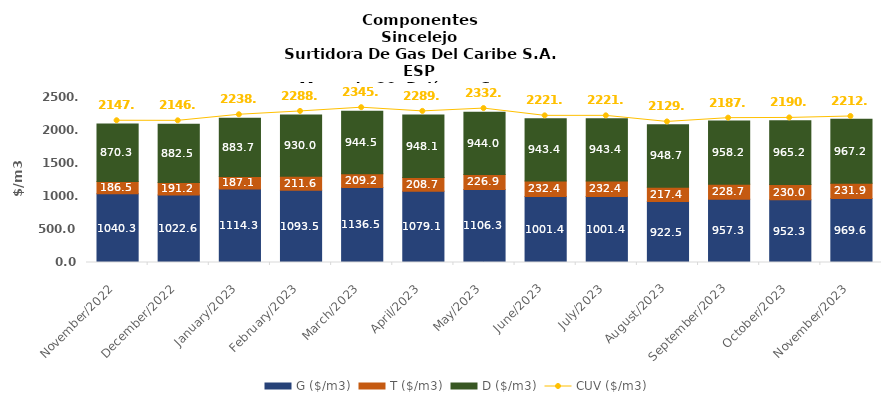
| Category | G ($/m3) | T ($/m3) | D ($/m3) |
|---|---|---|---|
| 2022-11-01 | 1040.34 | 186.54 | 870.26 |
| 2022-12-01 | 1022.62 | 191.17 | 882.47 |
| 2023-01-01 | 1114.3 | 187.05 | 883.66 |
| 2023-02-01 | 1093.5 | 211.55 | 930.03 |
| 2023-03-01 | 1136.5 | 209.16 | 944.52 |
| 2023-04-01 | 1079.14 | 208.7 | 948.13 |
| 2023-05-01 | 1106.33 | 226.94 | 944.03 |
| 2023-06-01 | 1001.4 | 232.37 | 943.37 |
| 2023-07-01 | 1001.4 | 232.37 | 943.37 |
| 2023-08-01 | 922.47 | 217.36 | 948.72 |
| 2023-09-01 | 957.29 | 228.69 | 958.18 |
| 2023-10-01 | 952.33 | 230.03 | 965.19 |
| 2023-11-01 | 969.64 | 231.88 | 967.17 |